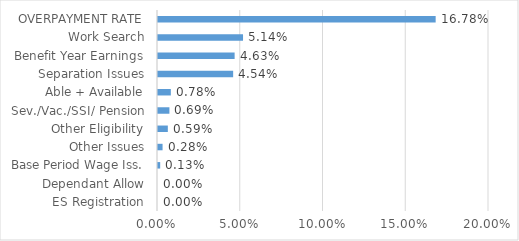
| Category | Series 0 |
|---|---|
| ES Registration | 0 |
| Dependant Allow | 0 |
| Base Period Wage Iss. | 0.001 |
| Other Issues | 0.003 |
| Other Eligibility | 0.006 |
| Sev./Vac./SSI/ Pension | 0.007 |
| Able + Available | 0.008 |
| Separation Issues | 0.045 |
| Benefit Year Earnings | 0.046 |
| Work Search | 0.051 |
| OVERPAYMENT RATE | 0.168 |